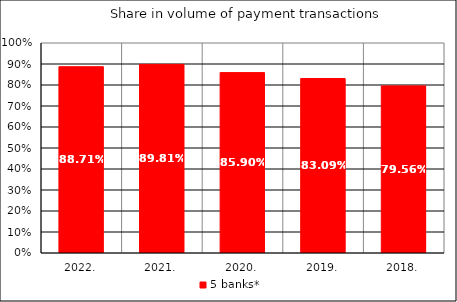
| Category | 5 banks* |
|---|---|
| 2022. | 0.887 |
| 2021. | 0.898 |
| 2020. | 0.859 |
| 2019. | 0.831 |
| 2018. | 0.796 |